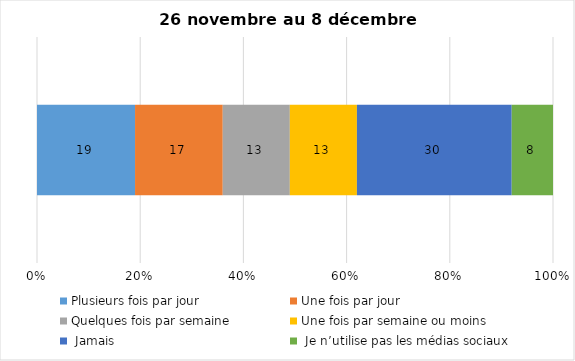
| Category | Plusieurs fois par jour | Une fois par jour | Quelques fois par semaine   | Une fois par semaine ou moins   |  Jamais   |  Je n’utilise pas les médias sociaux |
|---|---|---|---|---|---|---|
| 0 | 19 | 17 | 13 | 13 | 30 | 8 |